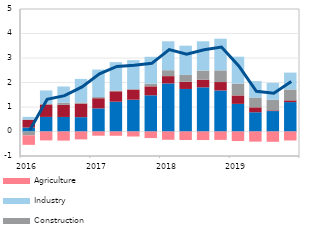
| Category | Other sectors | Trade | Construction | Industry | Agriculture |
|---|---|---|---|---|---|
| 2016 | 0.163 | 0.321 | -0.156 | 0.113 | -0.39 |
| II | 0.595 | 0.508 | 0.015 | 0.558 | -0.363 |
| III | 0.594 | 0.494 | 0.088 | 0.66 | -0.372 |
| IV | 0.585 | 0.553 | 0.046 | 0.96 | -0.322 |
| 2017 | 0.945 | 0.413 | 0.049 | 1.121 | -0.172 |
| II | 1.216 | 0.424 | 0.032 | 1.158 | -0.174 |
| III | 1.297 | 0.414 | 0.02 | 1.182 | -0.205 |
| IV | 1.478 | 0.366 | 0.113 | 1.094 | -0.268 |
| 2018 | 1.962 | 0.298 | 0.242 | 1.18 | -0.338 |
| II | 1.736 | 0.292 | 0.281 | 1.193 | -0.346 |
| III | 1.803 | 0.311 | 0.372 | 1.197 | -0.349 |
| IV | 1.675 | 0.344 | 0.476 | 1.293 | -0.341 |
| 2019 | 1.127 | 0.345 | 0.485 | 1.097 | -0.39 |
| II | 0.785 | 0.202 | 0.402 | 0.668 | -0.414 |
| III | 0.834 | 0.029 | 0.43 | 0.691 | -0.42 |
| IV | 1.2 | 0.072 | 0.444 | 0.687 | -0.366 |